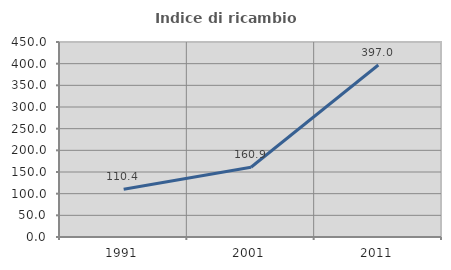
| Category | Indice di ricambio occupazionale  |
|---|---|
| 1991.0 | 110.417 |
| 2001.0 | 160.87 |
| 2011.0 | 396.97 |